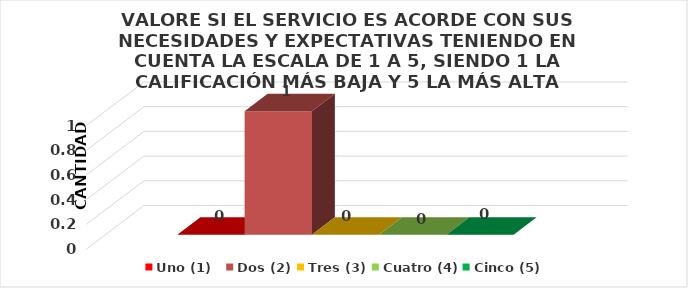
| Category | Uno (1)   | Dos (2) | Tres (3) | Cuatro (4) | Cinco (5) |
|---|---|---|---|---|---|
| 0 | 0 | 1 | 0 | 0 | 0 |